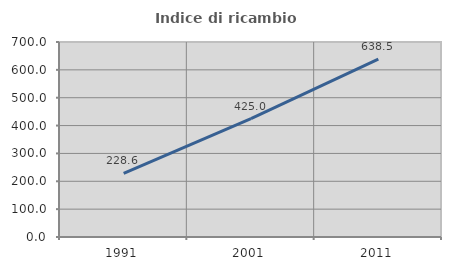
| Category | Indice di ricambio occupazionale  |
|---|---|
| 1991.0 | 228.571 |
| 2001.0 | 425 |
| 2011.0 | 638.462 |